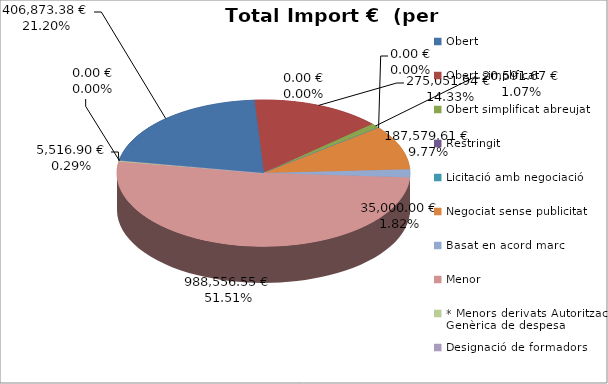
| Category | Total preu              (amb iva) |
|---|---|
| Obert | 406873.38 |
| Obert simplificat | 275051.94 |
| Obert simplificat abreujat | 20591.67 |
| Restringit | 0 |
| Licitació amb negociació | 0 |
| Negociat sense publicitat | 187579.61 |
| Basat en acord marc | 35000 |
| Menor | 988556.55 |
| * Menors derivats Autorització Genèrica de despesa | 5516.9 |
| Designació de formadors | 0 |